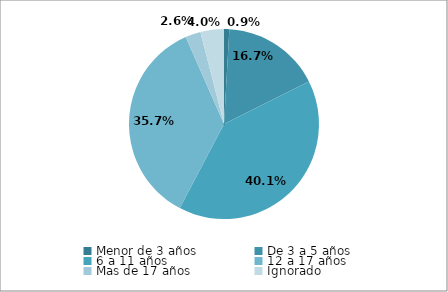
| Category | Menor de 3 años De 3 a 5 años 6 a 11 años 12 a 17 años Mas de 17 años Ignorado | Series 1 |
|---|---|---|
| Menor de 3 años | 0.009 | 0.009 |
| De 3 a 5 años | 0.167 | 0.167 |
| 6 a 11 años | 0.401 | 0.401 |
| 12 a 17 años | 0.357 | 0.357 |
| Mas de 17 años | 0.026 | 0.026 |
| Ignorado | 0.04 | 0.04 |